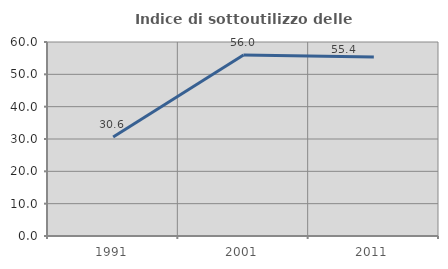
| Category | Indice di sottoutilizzo delle abitazioni  |
|---|---|
| 1991.0 | 30.631 |
| 2001.0 | 55.97 |
| 2011.0 | 55.385 |